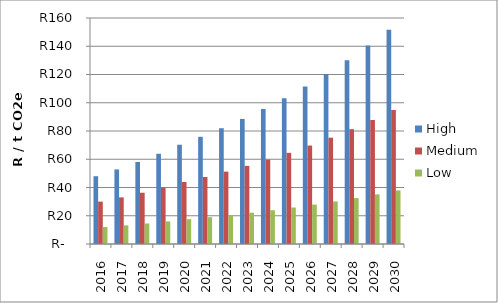
| Category | High | Medium | Low |
|---|---|---|---|
| 2016.0 | 48 | 30 | 12 |
| 2017.0 | 52.8 | 33 | 13.2 |
| 2018.0 | 58.08 | 36.3 | 14.52 |
| 2019.0 | 63.888 | 39.93 | 15.972 |
| 2020.0 | 70.277 | 43.923 | 17.569 |
| 2021.0 | 75.899 | 47.437 | 18.975 |
| 2022.0 | 81.971 | 51.232 | 20.493 |
| 2023.0 | 88.529 | 55.33 | 22.132 |
| 2024.0 | 95.611 | 59.757 | 23.903 |
| 2025.0 | 103.26 | 64.537 | 25.815 |
| 2026.0 | 111.52 | 69.7 | 27.88 |
| 2027.0 | 120.442 | 75.276 | 30.111 |
| 2028.0 | 130.077 | 81.298 | 32.519 |
| 2029.0 | 140.484 | 87.802 | 35.121 |
| 2030.0 | 151.722 | 94.826 | 37.931 |